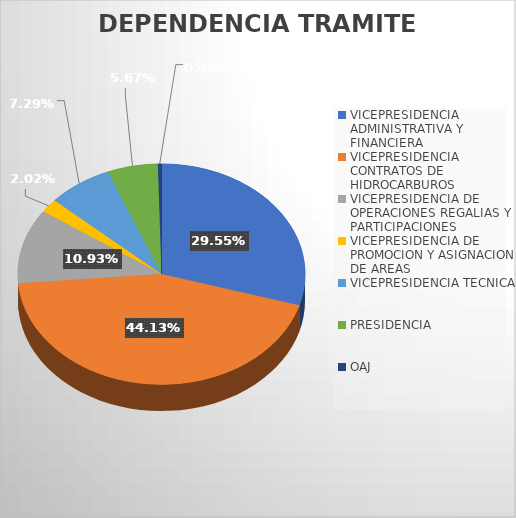
| Category | CANTIDAD |
|---|---|
| VICEPRESIDENCIA ADMINISTRATIVA Y FINANCIERA | 73 |
| VICEPRESIDENCIA CONTRATOS DE HIDROCARBUROS | 109 |
| VICEPRESIDENCIA DE OPERACIONES REGALIAS Y PARTICIPACIONES | 27 |
| VICEPRESIDENCIA DE PROMOCION Y ASIGNACION DE AREAS | 5 |
| VICEPRESIDENCIA TECNICA | 18 |
| PRESIDENCIA  | 14 |
| OAJ | 1 |